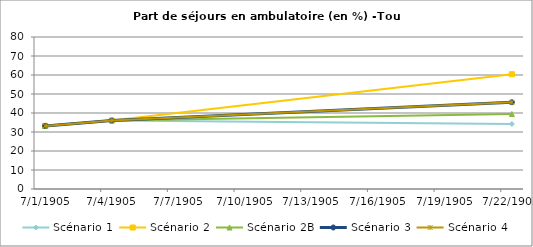
| Category | Scénario 1 | Scénario 2 | Scénario 2B | Scénario 3 | Scénario 4 |
|---|---|---|---|---|---|
| 2009.0 | 33.217 | 33.217 | 33.217 | 33.217 | 33.217 |
| 2012.0 | 36.044 | 36.044 | 36.044 | 36.044 | 36.044 |
| 2030.0 | 34.231 | 60.407 | 39.464 | 45.665 | 45.665 |